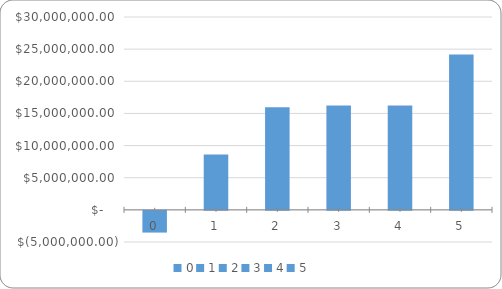
| Category | Series 0 |
|---|---|
| 0.0 | -3378225.8 |
| 1.0 | 8627310.902 |
| 2.0 | 15960114.345 |
| 3.0 | 16243721.716 |
| 4.0 | 16244080.224 |
| 5.0 | 24162560.759 |